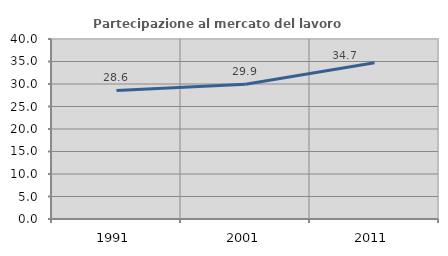
| Category | Partecipazione al mercato del lavoro  femminile |
|---|---|
| 1991.0 | 28.571 |
| 2001.0 | 29.944 |
| 2011.0 | 34.731 |